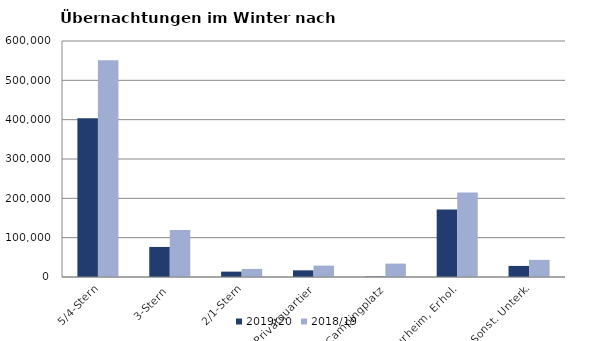
| Category | 2019/20 | 2018/19 |
|---|---|---|
| 5/4-Stern | 403679 | 550841 |
| 3-Stern | 76427 | 119793 |
| 2/1-Stern | 13667 | 20521 |
| Privatquartier | 16947 | 28892 |
| Campingplatz | 913 | 34073 |
| Kurheim, Erhol. | 171325 | 214912 |
| Sonst. Unterk. | 28154 | 43568 |